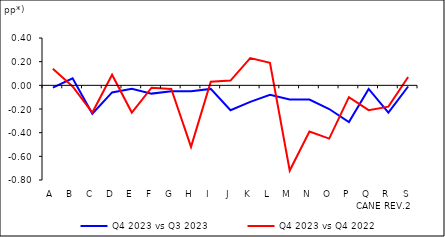
| Category | Q4 2023 vs Q3 2023 | Q4 2023 vs Q4 2022 |
|---|---|---|
| A | -0.02 | 0.14 |
| B | 0.06 | -0.01 |
| C | -0.24 | -0.23 |
| D | -0.06 | 0.09 |
| E | -0.03 | -0.23 |
| F | -0.07 | -0.02 |
| G | -0.05 | -0.03 |
| H | -0.05 | -0.52 |
| I | -0.03 | 0.03 |
| J | -0.21 | 0.04 |
| K | -0.14 | 0.23 |
| L | -0.08 | 0.19 |
| M | -0.12 | -0.72 |
| N | -0.12 | -0.39 |
| O | -0.2 | -0.45 |
| P | -0.31 | -0.1 |
| Q | -0.03 | -0.21 |
| R | -0.23 | -0.18 |
| S | -0.01 | 0.07 |